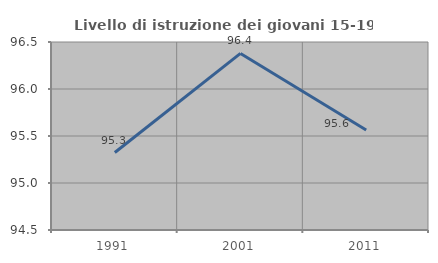
| Category | Livello di istruzione dei giovani 15-19 anni |
|---|---|
| 1991.0 | 95.324 |
| 2001.0 | 96.378 |
| 2011.0 | 95.564 |